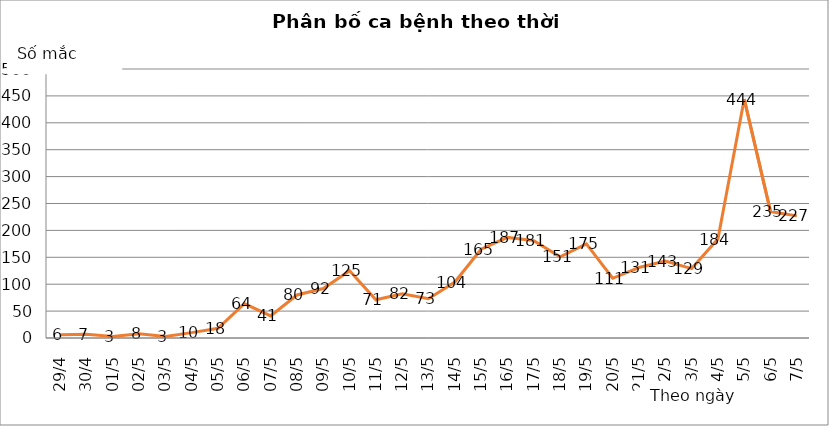
| Category | Series 0 |
|---|---|
| 29/4 | 6 |
| 30/4 | 7 |
| 01/5 | 3 |
| 02/5 | 8 |
| 03/5 | 3 |
| 04/5 | 10 |
| 05/5 | 18 |
| 06/5 | 64 |
| 07/5 | 41 |
| 08/5 | 80 |
| 09/5 | 92 |
| 10/5 | 125 |
| 11/5 | 71 |
| 12/5 | 82 |
| 13/5 | 73 |
| 14/5 | 104 |
| 15/5 | 165 |
| 16/5 | 187 |
| 17/5 | 181 |
| 18/5 | 151 |
| 19/5 | 175 |
| 20/5 | 111 |
| 21/5 | 131 |
| 22/5 | 143 |
| 23/5 | 129 |
| 24/5 | 184 |
| 25/5 | 444 |
| 26/5 | 235 |
| 27/5 | 227 |